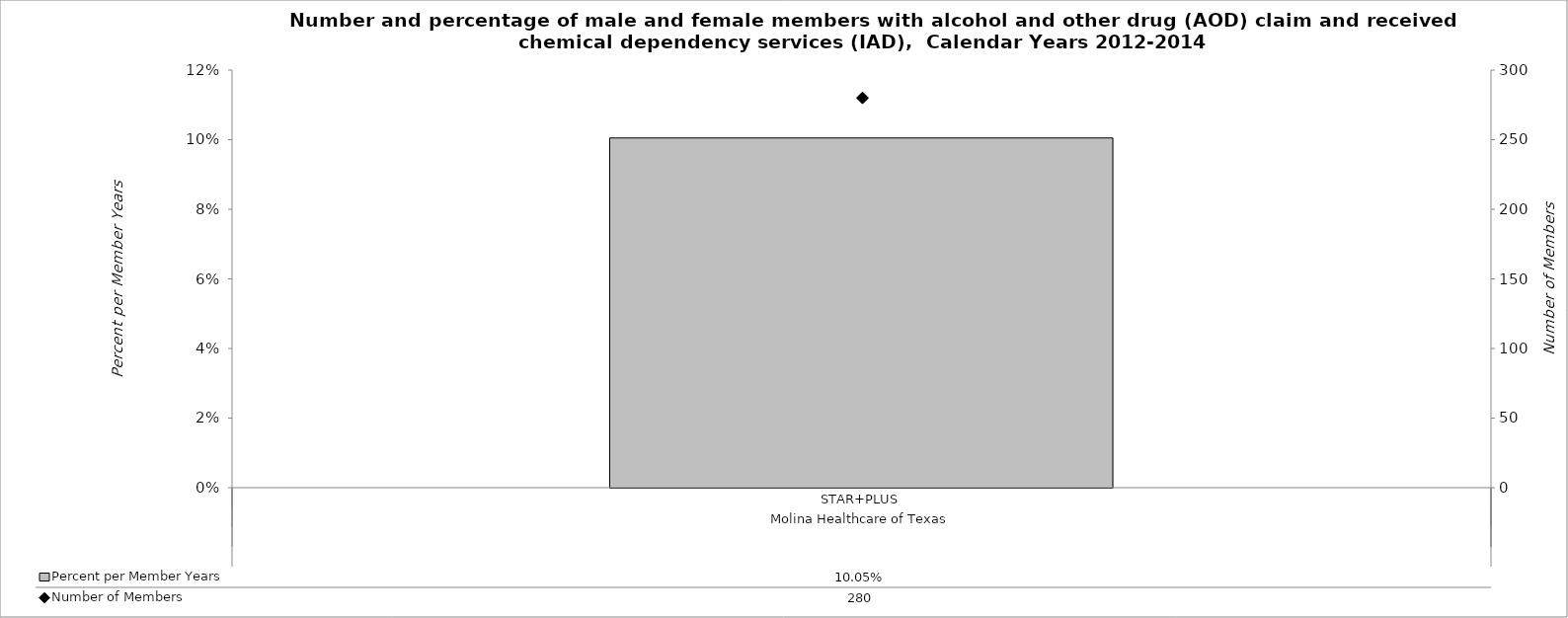
| Category | Percent per Member Years  |
|---|---|
| 0 | 0.1 |